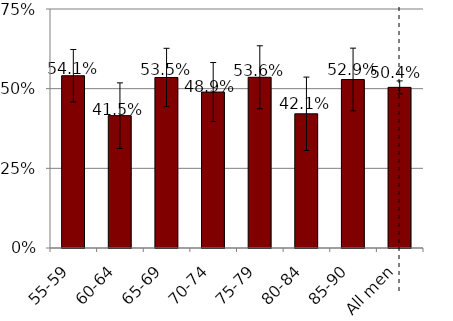
| Category | Series 0 |
|---|---|
| 55-59 | 0.541 |
| 60-64 | 0.415 |
| 65-69 | 0.535 |
| 70-74 | 0.489 |
| 75-79 | 0.536 |
| 80-84 | 0.421 |
| 85-90 | 0.529 |
| All men | 0.504 |